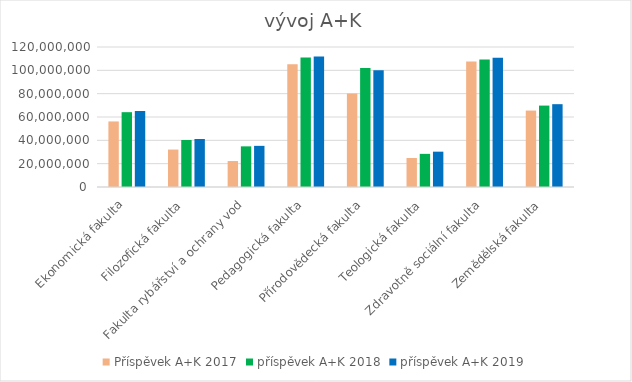
| Category | Příspěvek A+K 2017 | příspěvek A+K 2018 | příspěvek A+K 2019 |
|---|---|---|---|
| Ekonomická fakulta | 56198620 | 64133638 | 65131486 |
| Filozofická fakulta | 32098646 | 40266178 | 41157952 |
| Fakulta rybářství a ochrany vod | 22252483 | 34845080 | 35265075 |
| Pedagogická fakulta | 105144214 | 111057956 | 111813632 |
| Přírodovědecká fakulta | 80128673 | 101897204 | 100129209 |
| Teologická fakulta | 24867520 | 28405865 | 30284794 |
| Zdravotně sociální fakulta | 107611229 | 109360257 | 110819742 |
| Zemědělská fakulta | 65523939 | 69787412 | 70988657 |